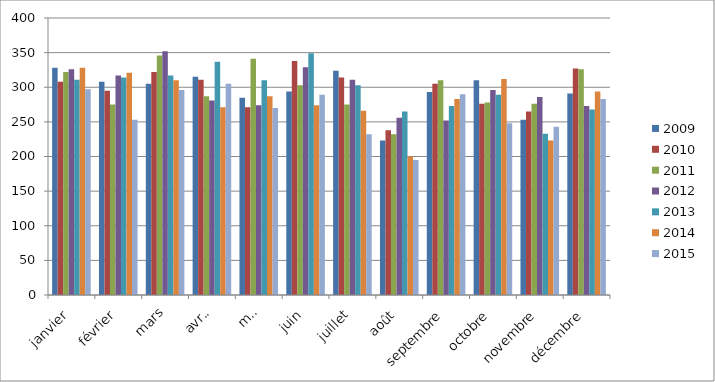
| Category | 2009 | 2010 | 2011 | 2012 | 2013 | 2014 | 2015 |
|---|---|---|---|---|---|---|---|
| janvier | 328 | 308 | 322 | 326 | 311 | 328 | 297 |
| février | 308 | 295 | 275 | 317 | 314 | 321 | 253 |
| mars | 305 | 322 | 346 | 352 | 317 | 310 | 296 |
| avril | 315 | 311 | 287 | 281 | 337 | 271 | 305 |
| mai | 285 | 271 | 341 | 274 | 310 | 287 | 270 |
| juin | 294 | 338 | 303 | 329 | 349 | 274 | 289 |
| juillet | 324 | 314 | 275 | 311 | 303 | 266 | 232 |
| août | 223 | 238 | 232 | 256 | 265 | 200 | 195 |
| septembre | 293 | 305 | 310 | 252 | 273 | 283 | 290 |
| octobre | 310 | 276 | 278 | 296 | 289 | 312 | 248 |
| novembre | 253 | 265 | 276 | 286 | 233 | 223 | 243 |
| décembre | 291 | 327 | 326 | 273 | 268 | 294 | 283 |